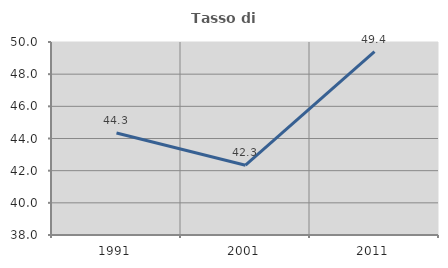
| Category | Tasso di occupazione   |
|---|---|
| 1991.0 | 44.344 |
| 2001.0 | 42.341 |
| 2011.0 | 49.408 |